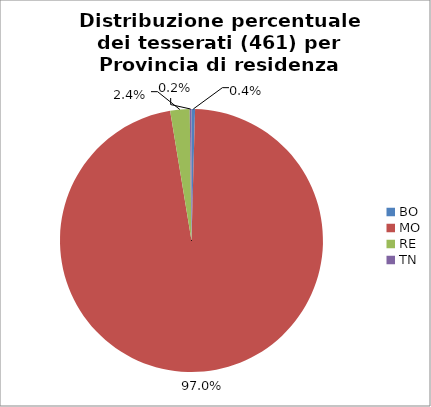
| Category | Nr. Tesserati |
|---|---|
| BO | 2 |
| MO | 447 |
| RE | 11 |
| TN | 1 |